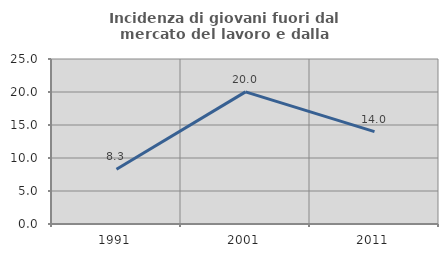
| Category | Incidenza di giovani fuori dal mercato del lavoro e dalla formazione  |
|---|---|
| 1991.0 | 8.297 |
| 2001.0 | 20.023 |
| 2011.0 | 13.987 |